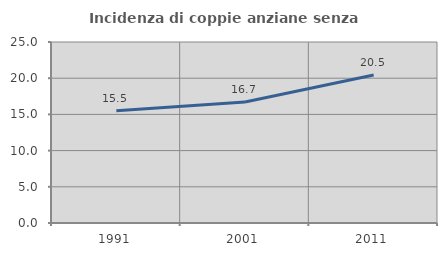
| Category | Incidenza di coppie anziane senza figli  |
|---|---|
| 1991.0 | 15.497 |
| 2001.0 | 16.71 |
| 2011.0 | 20.455 |